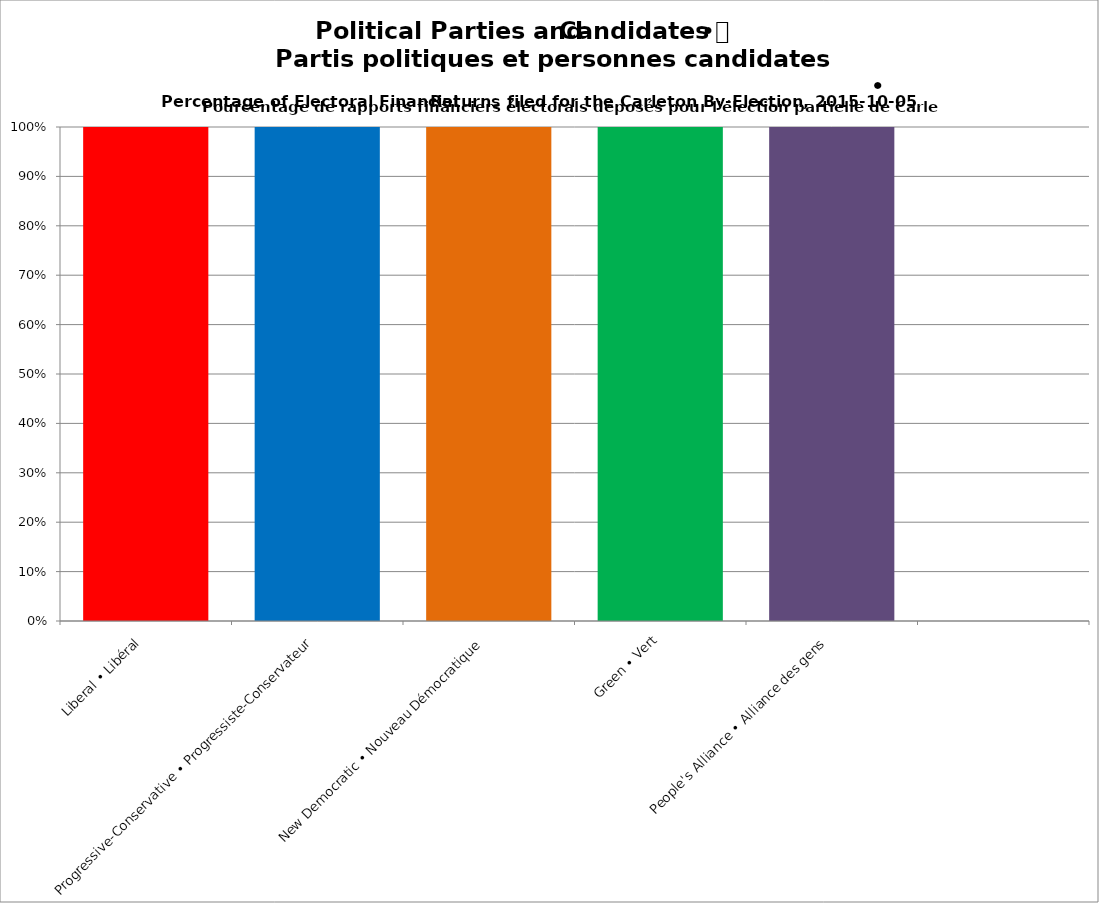
| Category | Series 0 | Series 2 | Series 4 |
|---|---|---|---|
| Liberal • Libéral | 1 |  |  |
| Progressive-Conservative • Progressiste-Conservateur | 1 |  |  |
| New Democratic • Nouveau Démocratique | 1 |  |  |
| Green • Vert | 1 |  |  |
| People's Alliance • Alliance des gens | 1 |  |  |